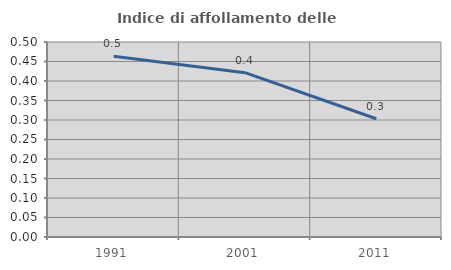
| Category | Indice di affollamento delle abitazioni  |
|---|---|
| 1991.0 | 0.463 |
| 2001.0 | 0.421 |
| 2011.0 | 0.303 |